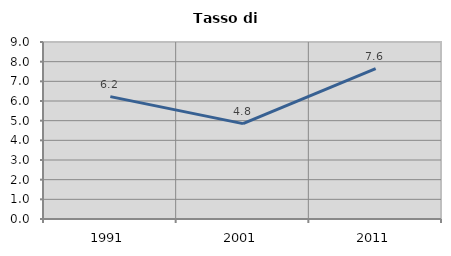
| Category | Tasso di disoccupazione   |
|---|---|
| 1991.0 | 6.221 |
| 2001.0 | 4.849 |
| 2011.0 | 7.641 |